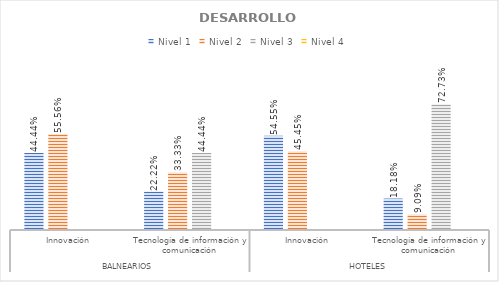
| Category | Nivel 1 | Nivel 2 | Nivel 3 | Nivel 4 |
|---|---|---|---|---|
| 0 | 0.444 | 0.556 | 0 | 0 |
| 1 | 0.222 | 0.333 | 0.444 | 0 |
| 2 | 0.545 | 0.455 | 0 | 0 |
| 3 | 0.182 | 0.091 | 0.727 | 0 |